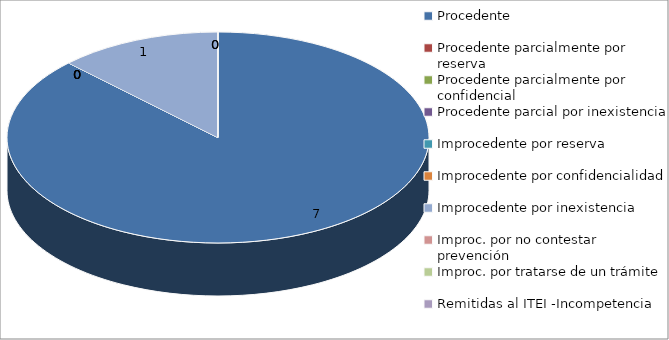
| Category | Series 0 |
|---|---|
| Procedente | 7 |
| Procedente parcialmente por reserva  | 0 |
| Procedente parcialmente por confidencial | 0 |
| Procedente parcial por inexistencia | 0 |
| Improcedente por reserva  | 0 |
| Improcedente por confidencialidad | 0 |
| Improcedente por inexistencia  | 1 |
| Improc. por no contestar prevención | 0 |
| Improc. por tratarse de un trámite  | 0 |
| Remitidas al ITEI -Incompetencia  | 0 |